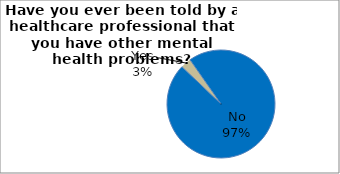
| Category | Series 0 |
|---|---|
| No | 96.856 |
| Yes | 3.144 |